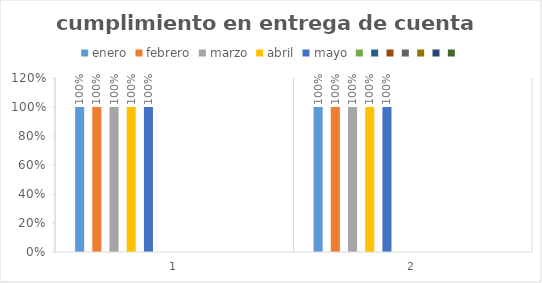
| Category | enero | febrero | marzo | abril | mayo | Series 5 | Series 6 | Series 7 | Series 8 | Series 9 | Series 10 | Series 11 |
|---|---|---|---|---|---|---|---|---|---|---|---|---|
| 0 | 1 | 1 | 1 | 1 | 1 |  |  |  |  |  |  |  |
| 1 | 1 | 1 | 1 | 1 | 1 |  |  |  |  |  |  |  |